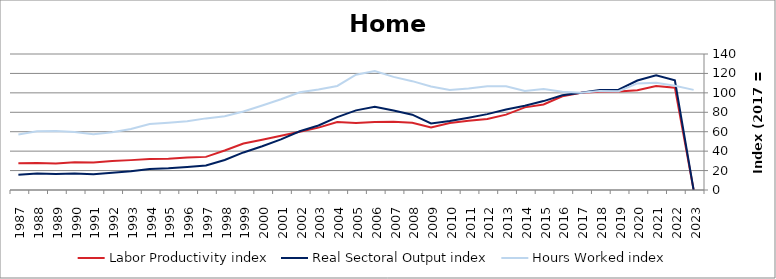
| Category | Labor Productivity index | Real Sectoral Output index | Hours Worked index |
|---|---|---|---|
| 2023.0 | 0 | 0 | 103.084 |
| 2022.0 | 105.346 | 112.973 | 107.24 |
| 2021.0 | 107.049 | 118.083 | 110.308 |
| 2020.0 | 102.683 | 112.694 | 109.75 |
| 2019.0 | 101.492 | 103.231 | 101.713 |
| 2018.0 | 101.11 | 103.053 | 101.922 |
| 2017.0 | 100 | 100 | 100 |
| 2016.0 | 96.449 | 97.513 | 101.102 |
| 2015.0 | 88.083 | 91.523 | 103.905 |
| 2014.0 | 85.063 | 86.647 | 101.862 |
| 2013.0 | 77.573 | 82.906 | 106.876 |
| 2012.0 | 73.069 | 78.083 | 106.862 |
| 2011.0 | 71.233 | 74.396 | 104.44 |
| 2010.0 | 68.909 | 70.994 | 103.026 |
| 2009.0 | 64.324 | 68.531 | 106.541 |
| 2008.0 | 69.228 | 77.567 | 112.046 |
| 2007.0 | 70.194 | 81.736 | 116.442 |
| 2006.0 | 69.937 | 85.644 | 122.458 |
| 2005.0 | 69.07 | 81.977 | 118.687 |
| 2004.0 | 70.046 | 75.039 | 107.128 |
| 2003.0 | 64.206 | 66.404 | 103.425 |
| 2002.0 | 60.022 | 60.423 | 100.669 |
| 2001.0 | 55.878 | 52.167 | 93.359 |
| 2000.0 | 51.757 | 45.035 | 87.012 |
| 1999.0 | 47.859 | 38.658 | 80.776 |
| 1998.0 | 40.629 | 30.831 | 75.885 |
| 1997.0 | 34.094 | 25.136 | 73.725 |
| 1996.0 | 33.373 | 23.647 | 70.858 |
| 1995.0 | 32.13 | 22.264 | 69.292 |
| 1994.0 | 31.834 | 21.644 | 67.99 |
| 1993.0 | 30.753 | 19.309 | 62.787 |
| 1992.0 | 29.843 | 17.747 | 59.468 |
| 1991.0 | 28.232 | 16.183 | 57.322 |
| 1990.0 | 28.634 | 17.07 | 59.613 |
| 1989.0 | 27.342 | 16.599 | 60.71 |
| 1988.0 | 27.911 | 16.894 | 60.528 |
| 1987.0 | 27.649 | 15.818 | 57.212 |